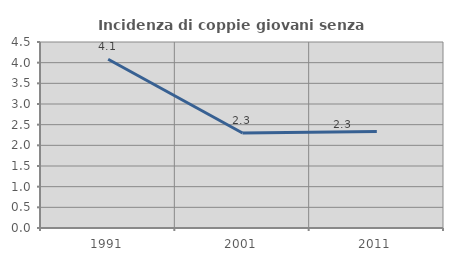
| Category | Incidenza di coppie giovani senza figli |
|---|---|
| 1991.0 | 4.082 |
| 2001.0 | 2.299 |
| 2011.0 | 2.337 |